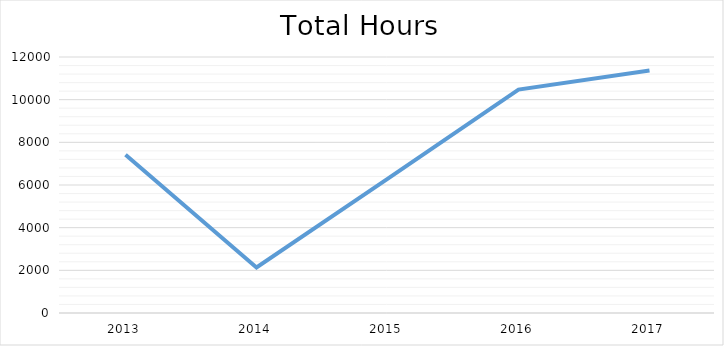
| Category | Series 0 |
|---|---|
| 2013.0 | 7414.28 |
| 2014.0 | 2133.7 |
| 2015.0 | 6284.51 |
| 2016.0 | 10472.09 |
| 2017.0 | 11370.43 |